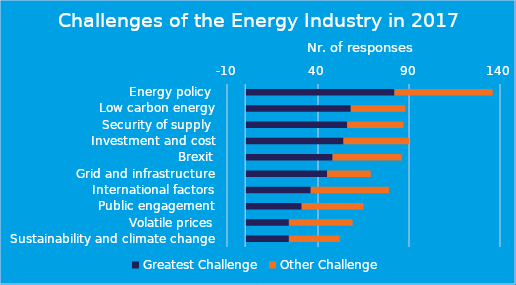
| Category | Greatest Challenge | Other Challenge |
|---|---|---|
| Energy policy  | 82 | 54 |
| Low carbon energy | 58 | 30 |
| Security of supply  | 56 | 31 |
| Investment and cost | 54 | 36 |
| Brexit | 48 | 38 |
| Grid and infrastructure | 45 | 24 |
| International factors | 36 | 43 |
| Public engagement | 31 | 34 |
| Volatile prices | 24 | 35 |
| Sustainability and climate change | 24 | 28 |